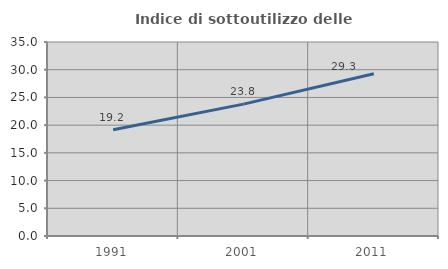
| Category | Indice di sottoutilizzo delle abitazioni  |
|---|---|
| 1991.0 | 19.185 |
| 2001.0 | 23.791 |
| 2011.0 | 29.268 |